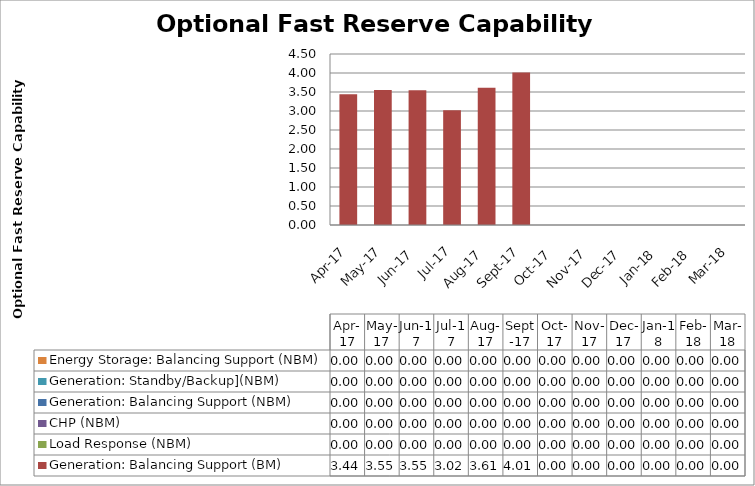
| Category | Generation: Balancing Support (BM) | Load Response (NBM) | CHP (NBM) | Generation: Balancing Support (NBM) | Generation: Standby/Backup](NBM) | Energy Storage: Balancing Support (NBM) |
|---|---|---|---|---|---|---|
| 2017-04-01 | 3.441 | 0 | 0 | 0 | 0 | 0 |
| 2017-05-01 | 3.55 | 0 | 0 | 0 | 0 | 0 |
| 2017-06-01 | 3.548 | 0 | 0 | 0 | 0 | 0 |
| 2017-07-01 | 3.017 | 0 | 0 | 0 | 0 | 0 |
| 2017-08-01 | 3.614 | 0 | 0 | 0 | 0 | 0 |
| 2017-09-01 | 4.015 | 0 | 0 | 0 | 0 | 0 |
| 2017-10-01 | 0 | 0 | 0 | 0 | 0 | 0 |
| 2017-11-01 | 0 | 0 | 0 | 0 | 0 | 0 |
| 2017-12-01 | 0 | 0 | 0 | 0 | 0 | 0 |
| 2018-01-01 | 0 | 0 | 0 | 0 | 0 | 0 |
| 2018-02-01 | 0 | 0 | 0 | 0 | 0 | 0 |
| 2018-03-01 | 0 | 0 | 0 | 0 | 0 | 0 |